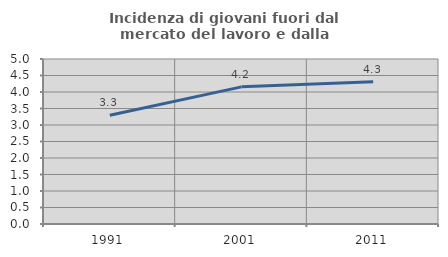
| Category | Incidenza di giovani fuori dal mercato del lavoro e dalla formazione  |
|---|---|
| 1991.0 | 3.297 |
| 2001.0 | 4.155 |
| 2011.0 | 4.308 |